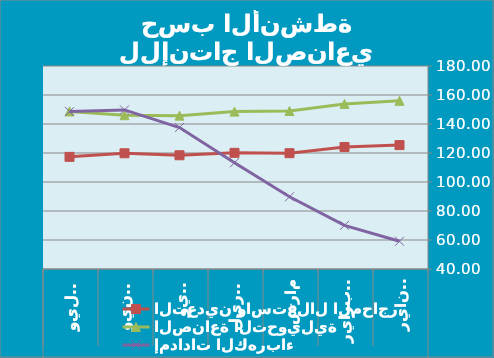
| Category | التعدين واستغلال المحاجر | الصناعة التحويلية | إمدادات الكهرباء |
|---|---|---|---|
| 0 | 125.45 | 155.98 | 59.15 |
| 1 | 124.14 | 153.87 | 70.1 |
| 2 | 119.87 | 148.98 | 89.82 |
| 3 | 120.11 | 148.54 | 113.29 |
| 4 | 118.43 | 145.76 | 137.57 |
| 5 | 119.81 | 146.05 | 149.7 |
| 6 | 117.33 | 148.68 | 148.56 |